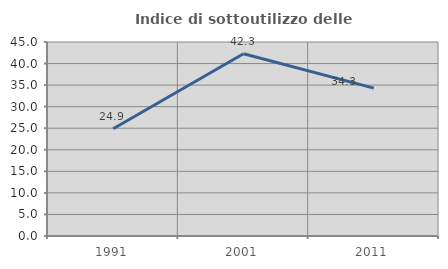
| Category | Indice di sottoutilizzo delle abitazioni  |
|---|---|
| 1991.0 | 24.88 |
| 2001.0 | 42.289 |
| 2011.0 | 34.3 |